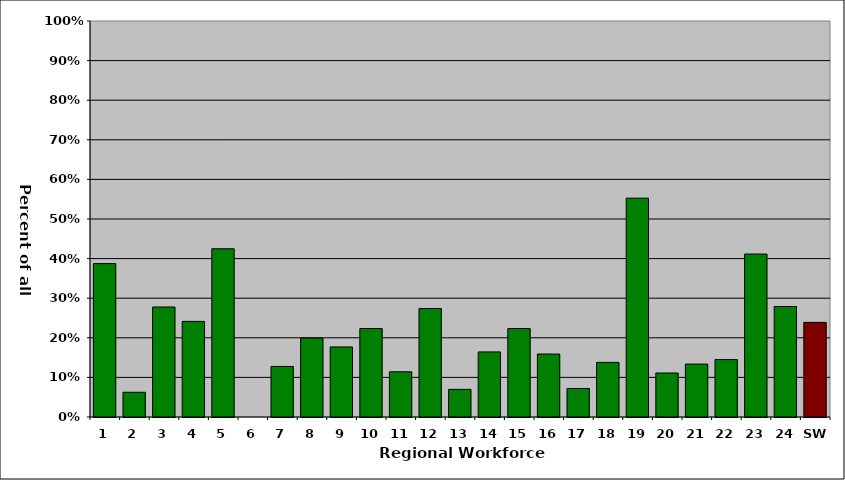
| Category | Series 0 |
|---|---|
| 1 | 0.387 |
| 2 | 0.062 |
| 3 | 0.278 |
| 4 | 0.241 |
| 5 | 0.425 |
| 6 | 0 |
| 7 | 0.128 |
| 8 | 0.2 |
| 9 | 0.177 |
| 10 | 0.223 |
| 11 | 0.114 |
| 12 | 0.274 |
| 13 | 0.07 |
| 14 | 0.164 |
| 15 | 0.223 |
| 16 | 0.159 |
| 17 | 0.072 |
| 18 | 0.138 |
| 19 | 0.553 |
| 20 | 0.111 |
| 21 | 0.134 |
| 22 | 0.145 |
| 23 | 0.412 |
| 24 | 0.279 |
| SW | 0.239 |